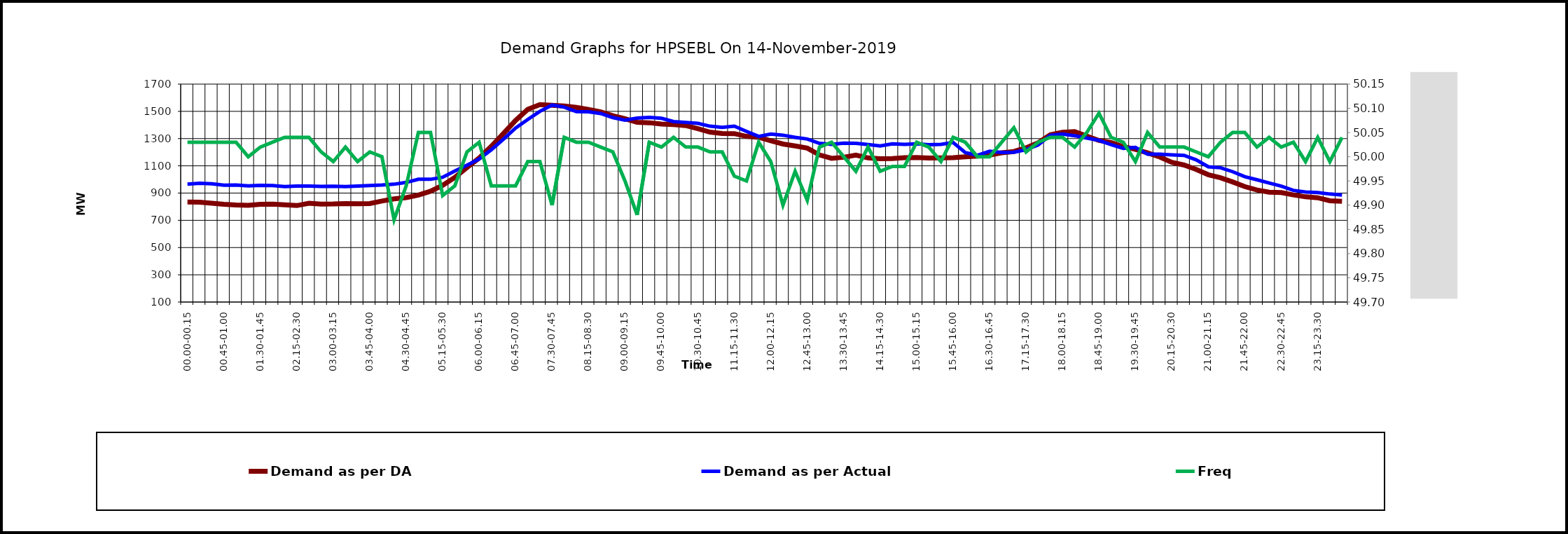
| Category | Demand as per DA | Demand as per Actual |
|---|---|---|
| 00.00-00.15 | 834.396 | 966 |
| 00.15-00.30 | 833.394 | 972 |
| 00.30-00.45 | 825.381 | 968 |
| 00.45-01.00 | 817.367 | 958 |
| 01.00-01.15 | 812.359 | 959 |
| 01.15-01.30 | 810.356 | 953 |
| 01.30-01.45 | 817.367 | 957 |
| 01.45-02:00 | 818.369 | 955 |
| 02.00-02.15 | 813.361 | 948 |
| 02.15-02.30 | 808.352 | 951 |
| 02.30-02.45 | 825.381 | 952 |
| 02.45-03:00 | 819.371 | 949 |
| 03.00-03.15 | 820.372 | 950 |
| 03.15-03.30 | 823.377 | 948 |
| 03.30-03.45 | 821.374 | 952 |
| 03.45-04.00 | 823.377 | 955 |
| 04.00-04.15 | 841.408 | 959 |
| 04.15-04.30 | 857.434 | 965 |
| 04.30-04.45 | 866.449 | 978 |
| 04.45-05.00 | 885.481 | 1001 |
| 05.00-05.15 | 913.528 | 1001 |
| 05.15-05.30 | 956.6 | 1016 |
| 05.30-05.45 | 1014.697 | 1062 |
| 05.45-06.00 | 1087.82 | 1105 |
| 06.00-06.15 | 1156.935 | 1150 |
| 06.15-06.30 | 1243.079 | 1218 |
| 06.30-06.45 | 1337.237 | 1296 |
| 06.45-07.00 | 1433.398 | 1378 |
| 07.00-07.15 | 1514.534 | 1440 |
| 07.15-07.30 | 1549.592 | 1500 |
| 07.30-07.45 | 1544.584 | 1546 |
| 07.45-08.00 | 1539.575 | 1531 |
| 08.00-08.15 | 1528.557 | 1498 |
| 08.15-08.30 | 1513.532 | 1497 |
| 08.30-08.45 | 1496.503 | 1484 |
| 08.45-09.00 | 1467.455 | 1454 |
| 09.00-09.15 | 1445.418 | 1435 |
| 09.15-09.30 | 1419.374 | 1451 |
| 09.30-09.45 | 1416.369 | 1456 |
| 09.45-10.00 | 1407.354 | 1449 |
| 10.00-10.15 | 1403.348 | 1425 |
| 10.15-10.30 | 1395.334 | 1419 |
| 10.30-10.45 | 1372.296 | 1412 |
| 10.45-11.00 | 1347.254 | 1391 |
| 11.00-11.15 | 1337.237 | 1383 |
| 11.15-11.30 | 1336.235 | 1391 |
| 11.30-11.45 | 1316.202 | 1353 |
| 11.45-12.00 | 1309.19 | 1316 |
| 12.00-12.15 | 1284.148 | 1333 |
| 12.15-12.30 | 1260.108 | 1325 |
| 12.30-12.45 | 1246.084 | 1309 |
| 12.45-13.00 | 1230.058 | 1297 |
| 13.00-13.15 | 1179.974 | 1265 |
| 13.15-13.30 | 1154.932 | 1258 |
| 13.30-13.45 | 1162.945 | 1267 |
| 13.45-14.00 | 1178.972 | 1265 |
| 14.00-14.15 | 1157.937 | 1256 |
| 14.15-14.30 | 1151.927 | 1246 |
| 14.30-14.45 | 1153.93 | 1261 |
| 14.45-15.00 | 1159.94 | 1258 |
| 15.00-15.15 | 1160.942 | 1261 |
| 15.15-15.30 | 1156.935 | 1255 |
| 15.30-15.45 | 1158.939 | 1258 |
| 15.45-16.00 | 1159.94 | 1271 |
| 16.00-16.15 | 1165.95 | 1197 |
| 16.15-16.30 | 1171.96 | 1177 |
| 16.30-16.45 | 1178.972 | 1207 |
| 16.45-17.00 | 1196.001 | 1199 |
| 17.00-17.15 | 1205.016 | 1200 |
| 17.15-17.30 | 1232.061 | 1218 |
| 17.30-17.45 | 1269.123 | 1254 |
| 17.45-18.00 | 1328.222 | 1324 |
| 18.00-18.15 | 1346.252 | 1333 |
| 18.15-18.30 | 1351.26 | 1321 |
| 18.30-18.45 | 1318.205 | 1304 |
| 18.45-19.00 | 1286.151 | 1287 |
| 19.00-19.15 | 1271.126 | 1255 |
| 19.15-19.30 | 1241.076 | 1228 |
| 19.30-19.45 | 1221.043 | 1235 |
| 19.45-20.00 | 1194.999 | 1185 |
| 20.00-20.15 | 1164.949 | 1185 |
| 20.15-20.30 | 1125.883 | 1181 |
| 20.30-20.45 | 1105.85 | 1177 |
| 20.45-21.00 | 1073.796 | 1144 |
| 21.00-21.15 | 1034.731 | 1093 |
| 21.15-21.30 | 1012.694 | 1086 |
| 21.30-21.45 | 981.642 | 1057 |
| 21.45-22.00 | 947.585 | 1020 |
| 22.00-22.15 | 922.543 | 998 |
| 22.15-22.30 | 906.516 | 974 |
| 22.30-22.45 | 903.511 | 951 |
| 22.45-23.00 | 886.483 | 920 |
| 23.00-23.15 | 872.459 | 908 |
| 23.15-23.30 | 865.448 | 904 |
| 23.30-23.45 | 843.411 | 893 |
| 23.45-24.00 | 839.404 | 886 |